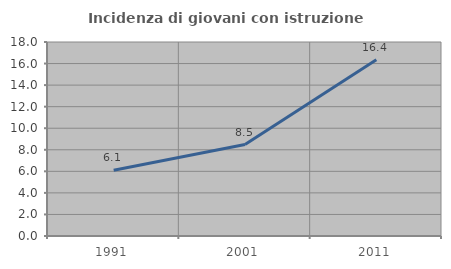
| Category | Incidenza di giovani con istruzione universitaria |
|---|---|
| 1991.0 | 6.102 |
| 2001.0 | 8.485 |
| 2011.0 | 16.354 |